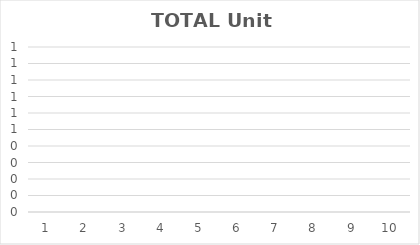
| Category | TOTAL Unit Sales |
|---|---|
| 0 | 0 |
| 1 | 0 |
| 2 | 0 |
| 3 | 0 |
| 4 | 0 |
| 5 | 0 |
| 6 | 0 |
| 7 | 0 |
| 8 | 0 |
| 9 | 0 |